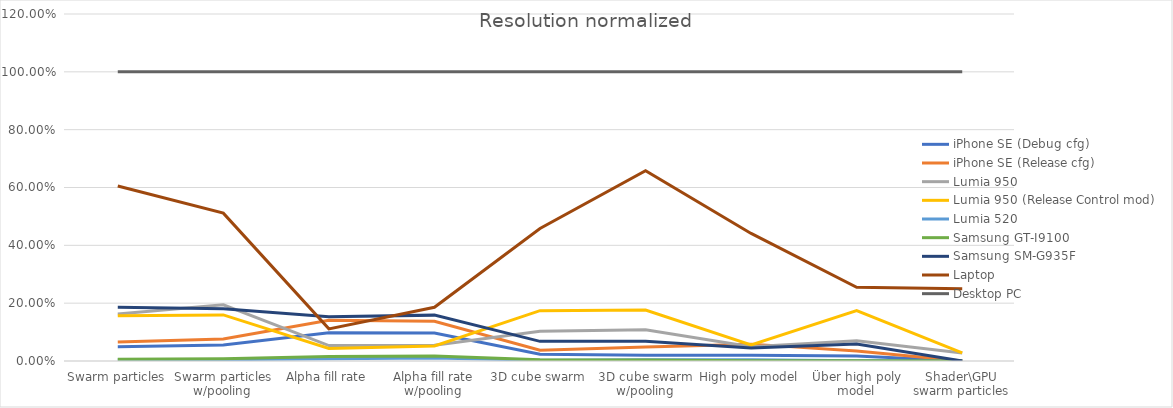
| Category | iPhone SE (Debug cfg) | iPhone SE (Release cfg) | Lumia 950 | Lumia 950 (Release Control mod) | Lumia 520 | Samsung GT-I9100 | Samsung SM-G935F | Laptop | Desktop PC |
|---|---|---|---|---|---|---|---|---|---|
| Swarm particles | 0.05 | 0.066 | 0.163 | 0.157 | 0.004 | 0.006 | 0.186 | 0.605 | 1 |
| Swarm particles w/pooling | 0.056 | 0.076 | 0.194 | 0.159 | 0.004 | 0.007 | 0.181 | 0.511 | 1 |
| Alpha fill rate | 0.098 | 0.141 | 0.053 | 0.043 | 0.008 | 0.016 | 0.153 | 0.111 | 1 |
| Alpha fill rate w/pooling | 0.097 | 0.137 | 0.055 | 0.052 | 0.01 | 0.018 | 0.159 | 0.186 | 1 |
| 3D cube swarm | 0.023 | 0.037 | 0.103 | 0.174 | 0.003 | 0.004 | 0.068 | 0.458 | 1 |
| 3D cube swarm w/pooling | 0.02 | 0.048 | 0.108 | 0.176 | 0.004 | 0.004 | 0.068 | 0.658 | 1 |
| High poly model | 0.02 | 0.058 | 0.05 | 0.056 | 0.004 | 0 | 0.045 | 0.441 | 1 |
| Über high poly model | 0.017 | 0.035 | 0.07 | 0.174 | 0.001 | 0 | 0.059 | 0.255 | 1 |
| Shader\GPU swarm particles | 0 | 0 | 0.028 | 0.028 | 0 | 0 | 0 | 0.25 | 1 |